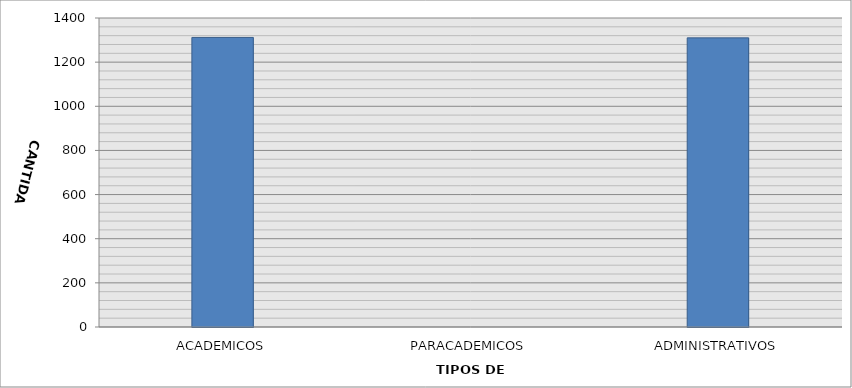
| Category | CANTIDAD |
|---|---|
| ACADEMICOS | 1312 |
| PARACADEMICOS | 0 |
| ADMINISTRATIVOS | 1310 |